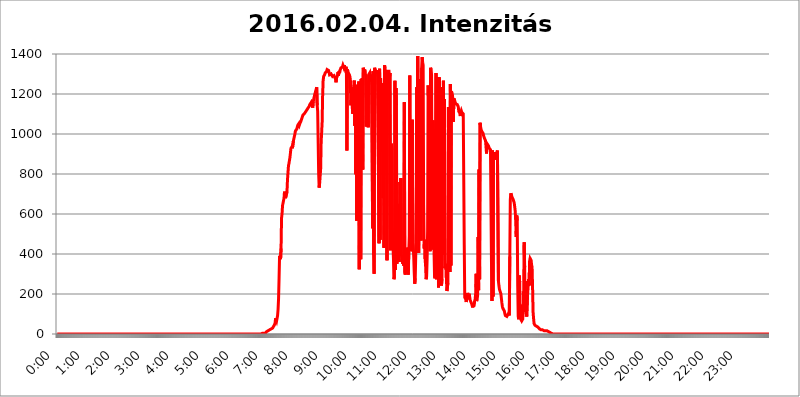
| Category | 2016.02.04. Intenzitás [W/m^2] |
|---|---|
| 0.0 | 0 |
| 0.0006944444444444445 | 0 |
| 0.001388888888888889 | 0 |
| 0.0020833333333333333 | 0 |
| 0.002777777777777778 | 0 |
| 0.003472222222222222 | 0 |
| 0.004166666666666667 | 0 |
| 0.004861111111111111 | 0 |
| 0.005555555555555556 | 0 |
| 0.0062499999999999995 | 0 |
| 0.006944444444444444 | 0 |
| 0.007638888888888889 | 0 |
| 0.008333333333333333 | 0 |
| 0.009027777777777779 | 0 |
| 0.009722222222222222 | 0 |
| 0.010416666666666666 | 0 |
| 0.011111111111111112 | 0 |
| 0.011805555555555555 | 0 |
| 0.012499999999999999 | 0 |
| 0.013194444444444444 | 0 |
| 0.013888888888888888 | 0 |
| 0.014583333333333332 | 0 |
| 0.015277777777777777 | 0 |
| 0.015972222222222224 | 0 |
| 0.016666666666666666 | 0 |
| 0.017361111111111112 | 0 |
| 0.018055555555555557 | 0 |
| 0.01875 | 0 |
| 0.019444444444444445 | 0 |
| 0.02013888888888889 | 0 |
| 0.020833333333333332 | 0 |
| 0.02152777777777778 | 0 |
| 0.022222222222222223 | 0 |
| 0.02291666666666667 | 0 |
| 0.02361111111111111 | 0 |
| 0.024305555555555556 | 0 |
| 0.024999999999999998 | 0 |
| 0.025694444444444447 | 0 |
| 0.02638888888888889 | 0 |
| 0.027083333333333334 | 0 |
| 0.027777777777777776 | 0 |
| 0.02847222222222222 | 0 |
| 0.029166666666666664 | 0 |
| 0.029861111111111113 | 0 |
| 0.030555555555555555 | 0 |
| 0.03125 | 0 |
| 0.03194444444444445 | 0 |
| 0.03263888888888889 | 0 |
| 0.03333333333333333 | 0 |
| 0.034027777777777775 | 0 |
| 0.034722222222222224 | 0 |
| 0.035416666666666666 | 0 |
| 0.036111111111111115 | 0 |
| 0.03680555555555556 | 0 |
| 0.0375 | 0 |
| 0.03819444444444444 | 0 |
| 0.03888888888888889 | 0 |
| 0.03958333333333333 | 0 |
| 0.04027777777777778 | 0 |
| 0.04097222222222222 | 0 |
| 0.041666666666666664 | 0 |
| 0.042361111111111106 | 0 |
| 0.04305555555555556 | 0 |
| 0.043750000000000004 | 0 |
| 0.044444444444444446 | 0 |
| 0.04513888888888889 | 0 |
| 0.04583333333333334 | 0 |
| 0.04652777777777778 | 0 |
| 0.04722222222222222 | 0 |
| 0.04791666666666666 | 0 |
| 0.04861111111111111 | 0 |
| 0.049305555555555554 | 0 |
| 0.049999999999999996 | 0 |
| 0.05069444444444445 | 0 |
| 0.051388888888888894 | 0 |
| 0.052083333333333336 | 0 |
| 0.05277777777777778 | 0 |
| 0.05347222222222222 | 0 |
| 0.05416666666666667 | 0 |
| 0.05486111111111111 | 0 |
| 0.05555555555555555 | 0 |
| 0.05625 | 0 |
| 0.05694444444444444 | 0 |
| 0.057638888888888885 | 0 |
| 0.05833333333333333 | 0 |
| 0.05902777777777778 | 0 |
| 0.059722222222222225 | 0 |
| 0.06041666666666667 | 0 |
| 0.061111111111111116 | 0 |
| 0.06180555555555556 | 0 |
| 0.0625 | 0 |
| 0.06319444444444444 | 0 |
| 0.06388888888888888 | 0 |
| 0.06458333333333334 | 0 |
| 0.06527777777777778 | 0 |
| 0.06597222222222222 | 0 |
| 0.06666666666666667 | 0 |
| 0.06736111111111111 | 0 |
| 0.06805555555555555 | 0 |
| 0.06874999999999999 | 0 |
| 0.06944444444444443 | 0 |
| 0.07013888888888889 | 0 |
| 0.07083333333333333 | 0 |
| 0.07152777777777779 | 0 |
| 0.07222222222222223 | 0 |
| 0.07291666666666667 | 0 |
| 0.07361111111111111 | 0 |
| 0.07430555555555556 | 0 |
| 0.075 | 0 |
| 0.07569444444444444 | 0 |
| 0.0763888888888889 | 0 |
| 0.07708333333333334 | 0 |
| 0.07777777777777778 | 0 |
| 0.07847222222222222 | 0 |
| 0.07916666666666666 | 0 |
| 0.0798611111111111 | 0 |
| 0.08055555555555556 | 0 |
| 0.08125 | 0 |
| 0.08194444444444444 | 0 |
| 0.08263888888888889 | 0 |
| 0.08333333333333333 | 0 |
| 0.08402777777777777 | 0 |
| 0.08472222222222221 | 0 |
| 0.08541666666666665 | 0 |
| 0.08611111111111112 | 0 |
| 0.08680555555555557 | 0 |
| 0.08750000000000001 | 0 |
| 0.08819444444444445 | 0 |
| 0.08888888888888889 | 0 |
| 0.08958333333333333 | 0 |
| 0.09027777777777778 | 0 |
| 0.09097222222222222 | 0 |
| 0.09166666666666667 | 0 |
| 0.09236111111111112 | 0 |
| 0.09305555555555556 | 0 |
| 0.09375 | 0 |
| 0.09444444444444444 | 0 |
| 0.09513888888888888 | 0 |
| 0.09583333333333333 | 0 |
| 0.09652777777777777 | 0 |
| 0.09722222222222222 | 0 |
| 0.09791666666666667 | 0 |
| 0.09861111111111111 | 0 |
| 0.09930555555555555 | 0 |
| 0.09999999999999999 | 0 |
| 0.10069444444444443 | 0 |
| 0.1013888888888889 | 0 |
| 0.10208333333333335 | 0 |
| 0.10277777777777779 | 0 |
| 0.10347222222222223 | 0 |
| 0.10416666666666667 | 0 |
| 0.10486111111111111 | 0 |
| 0.10555555555555556 | 0 |
| 0.10625 | 0 |
| 0.10694444444444444 | 0 |
| 0.1076388888888889 | 0 |
| 0.10833333333333334 | 0 |
| 0.10902777777777778 | 0 |
| 0.10972222222222222 | 0 |
| 0.1111111111111111 | 0 |
| 0.11180555555555556 | 0 |
| 0.11180555555555556 | 0 |
| 0.1125 | 0 |
| 0.11319444444444444 | 0 |
| 0.11388888888888889 | 0 |
| 0.11458333333333333 | 0 |
| 0.11527777777777777 | 0 |
| 0.11597222222222221 | 0 |
| 0.11666666666666665 | 0 |
| 0.1173611111111111 | 0 |
| 0.11805555555555557 | 0 |
| 0.11944444444444445 | 0 |
| 0.12013888888888889 | 0 |
| 0.12083333333333333 | 0 |
| 0.12152777777777778 | 0 |
| 0.12222222222222223 | 0 |
| 0.12291666666666667 | 0 |
| 0.12291666666666667 | 0 |
| 0.12361111111111112 | 0 |
| 0.12430555555555556 | 0 |
| 0.125 | 0 |
| 0.12569444444444444 | 0 |
| 0.12638888888888888 | 0 |
| 0.12708333333333333 | 0 |
| 0.16875 | 0 |
| 0.12847222222222224 | 0 |
| 0.12916666666666668 | 0 |
| 0.12986111111111112 | 0 |
| 0.13055555555555556 | 0 |
| 0.13125 | 0 |
| 0.13194444444444445 | 0 |
| 0.1326388888888889 | 0 |
| 0.13333333333333333 | 0 |
| 0.13402777777777777 | 0 |
| 0.13402777777777777 | 0 |
| 0.13472222222222222 | 0 |
| 0.13541666666666666 | 0 |
| 0.1361111111111111 | 0 |
| 0.13749999999999998 | 0 |
| 0.13819444444444443 | 0 |
| 0.1388888888888889 | 0 |
| 0.13958333333333334 | 0 |
| 0.14027777777777778 | 0 |
| 0.14097222222222222 | 0 |
| 0.14166666666666666 | 0 |
| 0.1423611111111111 | 0 |
| 0.14305555555555557 | 0 |
| 0.14375000000000002 | 0 |
| 0.14444444444444446 | 0 |
| 0.1451388888888889 | 0 |
| 0.1451388888888889 | 0 |
| 0.14652777777777778 | 0 |
| 0.14722222222222223 | 0 |
| 0.14791666666666667 | 0 |
| 0.1486111111111111 | 0 |
| 0.14930555555555555 | 0 |
| 0.15 | 0 |
| 0.15069444444444444 | 0 |
| 0.15138888888888888 | 0 |
| 0.15208333333333332 | 0 |
| 0.15277777777777776 | 0 |
| 0.15347222222222223 | 0 |
| 0.15416666666666667 | 0 |
| 0.15486111111111112 | 0 |
| 0.15555555555555556 | 0 |
| 0.15625 | 0 |
| 0.15694444444444444 | 0 |
| 0.15763888888888888 | 0 |
| 0.15833333333333333 | 0 |
| 0.15902777777777777 | 0 |
| 0.15972222222222224 | 0 |
| 0.16041666666666668 | 0 |
| 0.16111111111111112 | 0 |
| 0.16180555555555556 | 0 |
| 0.1625 | 0 |
| 0.16319444444444445 | 0 |
| 0.1638888888888889 | 0 |
| 0.16458333333333333 | 0 |
| 0.16527777777777777 | 0 |
| 0.16597222222222222 | 0 |
| 0.16666666666666666 | 0 |
| 0.1673611111111111 | 0 |
| 0.16805555555555554 | 0 |
| 0.16874999999999998 | 0 |
| 0.16944444444444443 | 0 |
| 0.17013888888888887 | 0 |
| 0.1708333333333333 | 0 |
| 0.17152777777777775 | 0 |
| 0.17222222222222225 | 0 |
| 0.1729166666666667 | 0 |
| 0.17361111111111113 | 0 |
| 0.17430555555555557 | 0 |
| 0.17500000000000002 | 0 |
| 0.17569444444444446 | 0 |
| 0.1763888888888889 | 0 |
| 0.17708333333333334 | 0 |
| 0.17777777777777778 | 0 |
| 0.17847222222222223 | 0 |
| 0.17916666666666667 | 0 |
| 0.1798611111111111 | 0 |
| 0.18055555555555555 | 0 |
| 0.18125 | 0 |
| 0.18194444444444444 | 0 |
| 0.1826388888888889 | 0 |
| 0.18333333333333335 | 0 |
| 0.1840277777777778 | 0 |
| 0.18472222222222223 | 0 |
| 0.18541666666666667 | 0 |
| 0.18611111111111112 | 0 |
| 0.18680555555555556 | 0 |
| 0.1875 | 0 |
| 0.18819444444444444 | 0 |
| 0.18888888888888888 | 0 |
| 0.18958333333333333 | 0 |
| 0.19027777777777777 | 0 |
| 0.1909722222222222 | 0 |
| 0.19166666666666665 | 0 |
| 0.19236111111111112 | 0 |
| 0.19305555555555554 | 0 |
| 0.19375 | 0 |
| 0.19444444444444445 | 0 |
| 0.1951388888888889 | 0 |
| 0.19583333333333333 | 0 |
| 0.19652777777777777 | 0 |
| 0.19722222222222222 | 0 |
| 0.19791666666666666 | 0 |
| 0.1986111111111111 | 0 |
| 0.19930555555555554 | 0 |
| 0.19999999999999998 | 0 |
| 0.20069444444444443 | 0 |
| 0.20138888888888887 | 0 |
| 0.2020833333333333 | 0 |
| 0.2027777777777778 | 0 |
| 0.2034722222222222 | 0 |
| 0.2041666666666667 | 0 |
| 0.20486111111111113 | 0 |
| 0.20555555555555557 | 0 |
| 0.20625000000000002 | 0 |
| 0.20694444444444446 | 0 |
| 0.2076388888888889 | 0 |
| 0.20833333333333334 | 0 |
| 0.20902777777777778 | 0 |
| 0.20972222222222223 | 0 |
| 0.21041666666666667 | 0 |
| 0.2111111111111111 | 0 |
| 0.21180555555555555 | 0 |
| 0.2125 | 0 |
| 0.21319444444444444 | 0 |
| 0.2138888888888889 | 0 |
| 0.21458333333333335 | 0 |
| 0.2152777777777778 | 0 |
| 0.21597222222222223 | 0 |
| 0.21666666666666667 | 0 |
| 0.21736111111111112 | 0 |
| 0.21805555555555556 | 0 |
| 0.21875 | 0 |
| 0.21944444444444444 | 0 |
| 0.22013888888888888 | 0 |
| 0.22083333333333333 | 0 |
| 0.22152777777777777 | 0 |
| 0.2222222222222222 | 0 |
| 0.22291666666666665 | 0 |
| 0.2236111111111111 | 0 |
| 0.22430555555555556 | 0 |
| 0.225 | 0 |
| 0.22569444444444445 | 0 |
| 0.2263888888888889 | 0 |
| 0.22708333333333333 | 0 |
| 0.22777777777777777 | 0 |
| 0.22847222222222222 | 0 |
| 0.22916666666666666 | 0 |
| 0.2298611111111111 | 0 |
| 0.23055555555555554 | 0 |
| 0.23124999999999998 | 0 |
| 0.23194444444444443 | 0 |
| 0.23263888888888887 | 0 |
| 0.2333333333333333 | 0 |
| 0.2340277777777778 | 0 |
| 0.2347222222222222 | 0 |
| 0.2354166666666667 | 0 |
| 0.23611111111111113 | 0 |
| 0.23680555555555557 | 0 |
| 0.23750000000000002 | 0 |
| 0.23819444444444446 | 0 |
| 0.2388888888888889 | 0 |
| 0.23958333333333334 | 0 |
| 0.24027777777777778 | 0 |
| 0.24097222222222223 | 0 |
| 0.24166666666666667 | 0 |
| 0.2423611111111111 | 0 |
| 0.24305555555555555 | 0 |
| 0.24375 | 0 |
| 0.24444444444444446 | 0 |
| 0.24513888888888888 | 0 |
| 0.24583333333333335 | 0 |
| 0.2465277777777778 | 0 |
| 0.24722222222222223 | 0 |
| 0.24791666666666667 | 0 |
| 0.24861111111111112 | 0 |
| 0.24930555555555556 | 0 |
| 0.25 | 0 |
| 0.25069444444444444 | 0 |
| 0.2513888888888889 | 0 |
| 0.2520833333333333 | 0 |
| 0.25277777777777777 | 0 |
| 0.2534722222222222 | 0 |
| 0.25416666666666665 | 0 |
| 0.2548611111111111 | 0 |
| 0.2555555555555556 | 0 |
| 0.25625000000000003 | 0 |
| 0.2569444444444445 | 0 |
| 0.2576388888888889 | 0 |
| 0.25833333333333336 | 0 |
| 0.2590277777777778 | 0 |
| 0.25972222222222224 | 0 |
| 0.2604166666666667 | 0 |
| 0.2611111111111111 | 0 |
| 0.26180555555555557 | 0 |
| 0.2625 | 0 |
| 0.26319444444444445 | 0 |
| 0.2638888888888889 | 0 |
| 0.26458333333333334 | 0 |
| 0.2652777777777778 | 0 |
| 0.2659722222222222 | 0 |
| 0.26666666666666666 | 0 |
| 0.2673611111111111 | 0 |
| 0.26805555555555555 | 0 |
| 0.26875 | 0 |
| 0.26944444444444443 | 0 |
| 0.2701388888888889 | 0 |
| 0.2708333333333333 | 0 |
| 0.27152777777777776 | 0 |
| 0.2722222222222222 | 0 |
| 0.27291666666666664 | 0 |
| 0.2736111111111111 | 0 |
| 0.2743055555555555 | 0 |
| 0.27499999999999997 | 0 |
| 0.27569444444444446 | 0 |
| 0.27638888888888885 | 0 |
| 0.27708333333333335 | 0 |
| 0.2777777777777778 | 0 |
| 0.27847222222222223 | 0 |
| 0.2791666666666667 | 0 |
| 0.2798611111111111 | 0 |
| 0.28055555555555556 | 0 |
| 0.28125 | 0 |
| 0.28194444444444444 | 0 |
| 0.2826388888888889 | 0 |
| 0.2833333333333333 | 0 |
| 0.28402777777777777 | 0 |
| 0.2847222222222222 | 0 |
| 0.28541666666666665 | 0 |
| 0.28611111111111115 | 0 |
| 0.28680555555555554 | 3.525 |
| 0.28750000000000003 | 3.525 |
| 0.2881944444444445 | 3.525 |
| 0.2888888888888889 | 3.525 |
| 0.28958333333333336 | 3.525 |
| 0.2902777777777778 | 3.525 |
| 0.29097222222222224 | 3.525 |
| 0.2916666666666667 | 3.525 |
| 0.2923611111111111 | 3.525 |
| 0.29305555555555557 | 7.887 |
| 0.29375 | 12.257 |
| 0.29444444444444445 | 12.257 |
| 0.2951388888888889 | 12.257 |
| 0.29583333333333334 | 16.636 |
| 0.2965277777777778 | 16.636 |
| 0.2972222222222222 | 16.636 |
| 0.29791666666666666 | 21.024 |
| 0.2986111111111111 | 21.024 |
| 0.29930555555555555 | 21.024 |
| 0.3 | 25.419 |
| 0.30069444444444443 | 25.419 |
| 0.3013888888888889 | 29.823 |
| 0.3020833333333333 | 29.823 |
| 0.30277777777777776 | 34.234 |
| 0.3034722222222222 | 38.653 |
| 0.30416666666666664 | 38.653 |
| 0.3048611111111111 | 47.511 |
| 0.3055555555555555 | 56.398 |
| 0.30624999999999997 | 78.722 |
| 0.3069444444444444 | 74.246 |
| 0.3076388888888889 | 65.31 |
| 0.30833333333333335 | 69.775 |
| 0.3090277777777778 | 92.184 |
| 0.30972222222222223 | 123.758 |
| 0.3104166666666667 | 178.264 |
| 0.3111111111111111 | 278.603 |
| 0.31180555555555556 | 391.685 |
| 0.3125 | 387.202 |
| 0.31319444444444444 | 373.729 |
| 0.3138888888888889 | 427.39 |
| 0.3145833333333333 | 579.542 |
| 0.31527777777777777 | 600.661 |
| 0.3159722222222222 | 642.4 |
| 0.31666666666666665 | 638.256 |
| 0.31736111111111115 | 638.256 |
| 0.31805555555555554 | 679.395 |
| 0.31875000000000003 | 711.832 |
| 0.3194444444444445 | 711.832 |
| 0.3201388888888889 | 679.395 |
| 0.32083333333333336 | 675.311 |
| 0.3215277777777778 | 679.395 |
| 0.32222222222222224 | 711.832 |
| 0.3229166666666667 | 771.559 |
| 0.3236111111111111 | 806.757 |
| 0.32430555555555557 | 841.526 |
| 0.325 | 853.029 |
| 0.32569444444444445 | 853.029 |
| 0.3263888888888889 | 883.516 |
| 0.32708333333333334 | 906.223 |
| 0.3277777777777778 | 928.819 |
| 0.3284722222222222 | 925.06 |
| 0.32916666666666666 | 936.33 |
| 0.3298611111111111 | 928.819 |
| 0.33055555555555555 | 925.06 |
| 0.33125 | 966.295 |
| 0.33194444444444443 | 977.508 |
| 0.3326388888888889 | 981.244 |
| 0.3333333333333333 | 999.916 |
| 0.3340277777777778 | 1014.852 |
| 0.3347222222222222 | 1018.587 |
| 0.3354166666666667 | 1018.587 |
| 0.3361111111111111 | 1026.06 |
| 0.3368055555555556 | 1037.277 |
| 0.33749999999999997 | 1044.762 |
| 0.33819444444444446 | 1044.762 |
| 0.33888888888888885 | 1052.255 |
| 0.33958333333333335 | 1044.762 |
| 0.34027777777777773 | 1052.255 |
| 0.34097222222222223 | 1052.255 |
| 0.3416666666666666 | 1063.51 |
| 0.3423611111111111 | 1071.027 |
| 0.3430555555555555 | 1078.555 |
| 0.34375 | 1082.324 |
| 0.3444444444444445 | 1093.653 |
| 0.3451388888888889 | 1097.437 |
| 0.3458333333333334 | 1097.437 |
| 0.34652777777777777 | 1101.226 |
| 0.34722222222222227 | 1101.226 |
| 0.34791666666666665 | 1101.226 |
| 0.34861111111111115 | 1112.618 |
| 0.34930555555555554 | 1108.816 |
| 0.35000000000000003 | 1116.426 |
| 0.3506944444444444 | 1124.056 |
| 0.3513888888888889 | 1124.056 |
| 0.3520833333333333 | 1131.708 |
| 0.3527777777777778 | 1135.543 |
| 0.3534722222222222 | 1139.384 |
| 0.3541666666666667 | 1147.086 |
| 0.3548611111111111 | 1147.086 |
| 0.35555555555555557 | 1150.946 |
| 0.35625 | 1158.689 |
| 0.35694444444444445 | 1158.689 |
| 0.3576388888888889 | 1162.571 |
| 0.35833333333333334 | 1131.708 |
| 0.3590277777777778 | 1162.571 |
| 0.3597222222222222 | 1174.263 |
| 0.36041666666666666 | 1186.03 |
| 0.3611111111111111 | 1197.876 |
| 0.36180555555555555 | 1205.82 |
| 0.3625 | 1201.843 |
| 0.36319444444444443 | 1209.807 |
| 0.3638888888888889 | 1233.951 |
| 0.3645833333333333 | 1143.232 |
| 0.3652777777777778 | 1112.618 |
| 0.3659722222222222 | 955.071 |
| 0.3666666666666667 | 798.974 |
| 0.3673611111111111 | 731.896 |
| 0.3680555555555556 | 755.766 |
| 0.36874999999999997 | 791.169 |
| 0.36944444444444446 | 826.123 |
| 0.37013888888888885 | 958.814 |
| 0.37083333333333335 | 958.814 |
| 0.37152777777777773 | 1059.756 |
| 0.37222222222222223 | 1193.918 |
| 0.3729166666666666 | 1266.8 |
| 0.3736111111111111 | 1287.761 |
| 0.3743055555555555 | 1291.997 |
| 0.375 | 1296.248 |
| 0.3756944444444445 | 1304.795 |
| 0.3763888888888889 | 1304.795 |
| 0.3770833333333334 | 1304.795 |
| 0.37777777777777777 | 1313.406 |
| 0.37847222222222227 | 1322.082 |
| 0.37916666666666665 | 1326.445 |
| 0.37986111111111115 | 1326.445 |
| 0.38055555555555554 | 1317.736 |
| 0.38125000000000003 | 1313.406 |
| 0.3819444444444444 | 1296.248 |
| 0.3826388888888889 | 1291.997 |
| 0.3833333333333333 | 1291.997 |
| 0.3840277777777778 | 1300.514 |
| 0.3847222222222222 | 1300.514 |
| 0.3854166666666667 | 1296.248 |
| 0.3861111111111111 | 1287.761 |
| 0.38680555555555557 | 1287.761 |
| 0.3875 | 1283.541 |
| 0.38819444444444445 | 1291.997 |
| 0.3888888888888889 | 1291.997 |
| 0.38958333333333334 | 1287.761 |
| 0.3902777777777778 | 1275.142 |
| 0.3909722222222222 | 1258.511 |
| 0.39166666666666666 | 1279.334 |
| 0.3923611111111111 | 1283.541 |
| 0.39305555555555555 | 1291.997 |
| 0.39375 | 1309.093 |
| 0.39444444444444443 | 1291.997 |
| 0.3951388888888889 | 1313.406 |
| 0.3958333333333333 | 1304.795 |
| 0.3965277777777778 | 1317.736 |
| 0.3972222222222222 | 1317.736 |
| 0.3979166666666667 | 1330.826 |
| 0.3986111111111111 | 1335.223 |
| 0.3993055555555556 | 1330.826 |
| 0.39999999999999997 | 1335.223 |
| 0.40069444444444446 | 1344.072 |
| 0.40138888888888885 | 1339.639 |
| 0.40208333333333335 | 1330.826 |
| 0.40277777777777773 | 1344.072 |
| 0.40347222222222223 | 1344.072 |
| 0.4041666666666666 | 1317.736 |
| 0.4048611111111111 | 1335.223 |
| 0.4055555555555555 | 1326.445 |
| 0.40625 | 917.534 |
| 0.4069444444444445 | 1322.082 |
| 0.4076388888888889 | 1313.406 |
| 0.4083333333333334 | 1304.795 |
| 0.40902777777777777 | 1309.093 |
| 0.40972222222222227 | 1296.248 |
| 0.41041666666666665 | 1287.761 |
| 0.41111111111111115 | 1270.964 |
| 0.41180555555555554 | 1143.232 |
| 0.41250000000000003 | 1193.918 |
| 0.4131944444444444 | 1170.358 |
| 0.4138888888888889 | 1127.879 |
| 0.4145833333333333 | 1101.226 |
| 0.4152777777777778 | 1233.951 |
| 0.4159722222222222 | 1217.812 |
| 0.4166666666666667 | 1266.8 |
| 0.4173611111111111 | 1041.019 |
| 0.41805555555555557 | 1246.176 |
| 0.41875 | 798.974 |
| 0.41944444444444445 | 1225.859 |
| 0.4201388888888889 | 566.793 |
| 0.42083333333333334 | 1233.951 |
| 0.4215277777777778 | 1154.814 |
| 0.4222222222222222 | 1217.812 |
| 0.42291666666666666 | 1262.649 |
| 0.4236111111111111 | 324.052 |
| 0.42430555555555555 | 1238.014 |
| 0.425 | 1108.816 |
| 0.42569444444444443 | 373.729 |
| 0.4263888888888889 | 1275.142 |
| 0.4270833333333333 | 1205.82 |
| 0.4277777777777778 | 1279.334 |
| 0.4284722222222222 | 822.26 |
| 0.4291666666666667 | 1330.826 |
| 0.4298611111111111 | 1326.445 |
| 0.4305555555555556 | 1313.406 |
| 0.43124999999999997 | 1322.082 |
| 0.43194444444444446 | 1304.795 |
| 0.43263888888888885 | 1291.997 |
| 0.43333333333333335 | 1037.277 |
| 0.43402777777777773 | 1242.089 |
| 0.43472222222222223 | 1147.086 |
| 0.4354166666666666 | 1266.8 |
| 0.4361111111111111 | 1033.537 |
| 0.4368055555555555 | 1296.248 |
| 0.4375 | 1300.514 |
| 0.4381944444444445 | 1304.795 |
| 0.4388888888888889 | 1262.649 |
| 0.4395833333333334 | 1296.248 |
| 0.44027777777777777 | 1283.541 |
| 0.44097222222222227 | 1291.997 |
| 0.44166666666666665 | 1291.997 |
| 0.44236111111111115 | 528.2 |
| 0.44305555555555554 | 1313.406 |
| 0.44375000000000003 | 396.164 |
| 0.4444444444444444 | 301.354 |
| 0.4451388888888889 | 1330.826 |
| 0.4458333333333333 | 1317.736 |
| 0.4465277777777778 | 1313.406 |
| 0.4472222222222222 | 1313.406 |
| 0.4479166666666667 | 1313.406 |
| 0.4486111111111111 | 1300.514 |
| 0.44930555555555557 | 1317.736 |
| 0.45 | 1313.406 |
| 0.45069444444444445 | 1317.736 |
| 0.4513888888888889 | 453.968 |
| 0.45208333333333334 | 1326.445 |
| 0.4527777777777778 | 471.582 |
| 0.4534722222222222 | 1279.334 |
| 0.45416666666666666 | 943.832 |
| 0.4548611111111111 | 909.996 |
| 0.45555555555555555 | 1254.387 |
| 0.45625 | 1254.387 |
| 0.45694444444444443 | 679.395 |
| 0.4576388888888889 | 984.98 |
| 0.4583333333333333 | 431.833 |
| 0.4590277777777778 | 1344.072 |
| 0.4597222222222222 | 1330.826 |
| 0.4604166666666667 | 1296.248 |
| 0.4611111111111111 | 818.392 |
| 0.4618055555555556 | 1317.736 |
| 0.46249999999999997 | 369.23 |
| 0.46319444444444446 | 1313.406 |
| 0.46388888888888885 | 1317.736 |
| 0.46458333333333335 | 1313.406 |
| 0.46527777777777773 | 1313.406 |
| 0.46597222222222223 | 1283.541 |
| 0.4666666666666666 | 1304.795 |
| 0.4673611111111111 | 418.492 |
| 0.4680555555555555 | 806.757 |
| 0.46875 | 951.327 |
| 0.4694444444444445 | 921.298 |
| 0.4701388888888889 | 515.223 |
| 0.4708333333333334 | 449.551 |
| 0.47152777777777777 | 378.224 |
| 0.47222222222222227 | 274.047 |
| 0.47291666666666665 | 287.709 |
| 0.47361111111111115 | 1266.8 |
| 0.47430555555555554 | 319.517 |
| 0.47500000000000003 | 1229.899 |
| 0.4756944444444444 | 1143.232 |
| 0.4763888888888889 | 351.198 |
| 0.4770833333333333 | 431.833 |
| 0.4777777777777778 | 650.667 |
| 0.4784722222222222 | 382.715 |
| 0.4791666666666667 | 360.221 |
| 0.4798611111111111 | 467.187 |
| 0.48055555555555557 | 759.723 |
| 0.48125 | 400.638 |
| 0.48194444444444445 | 779.42 |
| 0.4826388888888889 | 405.108 |
| 0.48333333333333334 | 360.221 |
| 0.4840277777777778 | 373.729 |
| 0.4847222222222222 | 351.198 |
| 0.48541666666666666 | 378.224 |
| 0.4861111111111111 | 342.162 |
| 0.48680555555555555 | 1158.689 |
| 0.4875 | 305.898 |
| 0.48819444444444443 | 296.808 |
| 0.4888888888888889 | 378.224 |
| 0.4895833333333333 | 378.224 |
| 0.4902777777777778 | 431.833 |
| 0.4909722222222222 | 351.198 |
| 0.4916666666666667 | 319.517 |
| 0.4923611111111111 | 296.808 |
| 0.4930555555555556 | 409.574 |
| 0.49374999999999997 | 489.108 |
| 0.49444444444444446 | 1291.997 |
| 0.49513888888888885 | 502.192 |
| 0.49583333333333335 | 471.582 |
| 0.49652777777777773 | 625.784 |
| 0.49722222222222223 | 414.035 |
| 0.4979166666666666 | 1071.027 |
| 0.4986111111111111 | 462.786 |
| 0.4993055555555555 | 440.702 |
| 0.5 | 382.715 |
| 0.5006944444444444 | 305.898 |
| 0.5013888888888889 | 251.251 |
| 0.5020833333333333 | 278.603 |
| 0.5027777777777778 | 391.685 |
| 0.5034722222222222 | 719.877 |
| 0.5041666666666667 | 1233.951 |
| 0.5048611111111111 | 604.864 |
| 0.5055555555555555 | 1389.456 |
| 0.50625 | 970.034 |
| 0.5069444444444444 | 405.108 |
| 0.5076388888888889 | 1089.873 |
| 0.5083333333333333 | 541.121 |
| 0.5090277777777777 | 1275.142 |
| 0.5097222222222222 | 553.986 |
| 0.5104166666666666 | 467.187 |
| 0.5111111111111112 | 1330.826 |
| 0.5118055555555555 | 1384.828 |
| 0.5125000000000001 | 1357.483 |
| 0.5131944444444444 | 1344.072 |
| 0.513888888888889 | 646.537 |
| 0.5145833333333333 | 427.39 |
| 0.5152777777777778 | 471.582 |
| 0.5159722222222222 | 373.729 |
| 0.5166666666666667 | 337.639 |
| 0.517361111111111 | 274.047 |
| 0.5180555555555556 | 287.709 |
| 0.5187499999999999 | 373.729 |
| 0.5194444444444445 | 515.223 |
| 0.5201388888888888 | 1242.089 |
| 0.5208333333333334 | 1150.946 |
| 0.5215277777777778 | 1217.812 |
| 0.5222222222222223 | 536.82 |
| 0.5229166666666667 | 414.035 |
| 0.5236111111111111 | 1330.826 |
| 0.5243055555555556 | 1322.082 |
| 0.525 | 1296.248 |
| 0.5256944444444445 | 629.948 |
| 0.5263888888888889 | 422.943 |
| 0.5270833333333333 | 1067.267 |
| 0.5277777777777778 | 1003.65 |
| 0.5284722222222222 | 409.574 |
| 0.5291666666666667 | 287.709 |
| 0.5298611111111111 | 278.603 |
| 0.5305555555555556 | 902.447 |
| 0.53125 | 1304.795 |
| 0.5319444444444444 | 274.047 |
| 0.5326388888888889 | 1283.541 |
| 0.5333333333333333 | 1270.964 |
| 0.5340277777777778 | 1139.384 |
| 0.5347222222222222 | 233 |
| 0.5354166666666667 | 1283.541 |
| 0.5361111111111111 | 1266.8 |
| 0.5368055555555555 | 301.354 |
| 0.5375 | 287.709 |
| 0.5381944444444444 | 274.047 |
| 0.5388888888888889 | 242.127 |
| 0.5395833333333333 | 274.047 |
| 0.5402777777777777 | 1233.951 |
| 0.5409722222222222 | 396.164 |
| 0.5416666666666666 | 1266.8 |
| 0.5423611111111112 | 458.38 |
| 0.5430555555555555 | 1174.263 |
| 0.5437500000000001 | 328.584 |
| 0.5444444444444444 | 333.113 |
| 0.545138888888889 | 351.198 |
| 0.5458333333333333 | 274.047 |
| 0.5465277777777778 | 214.746 |
| 0.5472222222222222 | 214.746 |
| 0.5479166666666667 | 255.813 |
| 0.548611111111111 | 1135.543 |
| 0.5493055555555556 | 328.584 |
| 0.5499999999999999 | 502.192 |
| 0.5506944444444445 | 310.44 |
| 0.5513888888888888 | 1250.275 |
| 0.5520833333333334 | 342.162 |
| 0.5527777777777778 | 1213.804 |
| 0.5534722222222223 | 1205.82 |
| 0.5541666666666667 | 1197.876 |
| 0.5548611111111111 | 1174.263 |
| 0.5555555555555556 | 1059.756 |
| 0.55625 | 1178.177 |
| 0.5569444444444445 | 1174.263 |
| 0.5576388888888889 | 1162.571 |
| 0.5583333333333333 | 1162.571 |
| 0.5590277777777778 | 1150.946 |
| 0.5597222222222222 | 1154.814 |
| 0.5604166666666667 | 1147.086 |
| 0.5611111111111111 | 1147.086 |
| 0.5618055555555556 | 1147.086 |
| 0.5625 | 1135.543 |
| 0.5631944444444444 | 1112.618 |
| 0.5638888888888889 | 1116.426 |
| 0.5645833333333333 | 1105.019 |
| 0.5652777777777778 | 1089.873 |
| 0.5659722222222222 | 1108.816 |
| 0.5666666666666667 | 1116.426 |
| 0.5673611111111111 | 1108.816 |
| 0.5680555555555555 | 1112.618 |
| 0.56875 | 1105.019 |
| 0.5694444444444444 | 1101.226 |
| 0.5701388888888889 | 1105.019 |
| 0.5708333333333333 | 445.129 |
| 0.5715277777777777 | 182.82 |
| 0.5722222222222222 | 178.264 |
| 0.5729166666666666 | 173.709 |
| 0.5736111111111112 | 160.056 |
| 0.5743055555555555 | 173.709 |
| 0.5750000000000001 | 187.378 |
| 0.5756944444444444 | 205.62 |
| 0.576388888888889 | 173.709 |
| 0.5770833333333333 | 191.937 |
| 0.5777777777777778 | 201.058 |
| 0.5784722222222222 | 182.82 |
| 0.5791666666666667 | 169.156 |
| 0.579861111111111 | 169.156 |
| 0.5805555555555556 | 164.605 |
| 0.5812499999999999 | 150.964 |
| 0.5819444444444445 | 141.884 |
| 0.5826388888888888 | 132.814 |
| 0.5833333333333334 | 146.423 |
| 0.5840277777777778 | 137.347 |
| 0.5847222222222223 | 132.814 |
| 0.5854166666666667 | 164.605 |
| 0.5861111111111111 | 173.709 |
| 0.5868055555555556 | 201.058 |
| 0.5875 | 301.354 |
| 0.5881944444444445 | 164.605 |
| 0.5888888888888889 | 173.709 |
| 0.5895833333333333 | 191.937 |
| 0.5902777777777778 | 484.735 |
| 0.5909722222222222 | 219.309 |
| 0.5916666666666667 | 822.26 |
| 0.5923611111111111 | 274.047 |
| 0.5930555555555556 | 1056.004 |
| 0.59375 | 1037.277 |
| 0.5944444444444444 | 1022.323 |
| 0.5951388888888889 | 1022.323 |
| 0.5958333333333333 | 1011.118 |
| 0.5965277777777778 | 1007.383 |
| 0.5972222222222222 | 1003.65 |
| 0.5979166666666667 | 992.448 |
| 0.5986111111111111 | 992.448 |
| 0.5993055555555555 | 977.508 |
| 0.6 | 977.508 |
| 0.6006944444444444 | 966.295 |
| 0.6013888888888889 | 966.295 |
| 0.6020833333333333 | 902.447 |
| 0.6027777777777777 | 951.327 |
| 0.6034722222222222 | 955.071 |
| 0.6041666666666666 | 947.58 |
| 0.6048611111111112 | 940.082 |
| 0.6055555555555555 | 932.576 |
| 0.6062500000000001 | 932.576 |
| 0.6069444444444444 | 932.576 |
| 0.607638888888889 | 921.298 |
| 0.6083333333333333 | 917.534 |
| 0.6090277777777778 | 360.221 |
| 0.6097222222222222 | 164.605 |
| 0.6104166666666667 | 917.534 |
| 0.611111111111111 | 187.378 |
| 0.6118055555555556 | 887.309 |
| 0.6124999999999999 | 909.996 |
| 0.6131944444444445 | 872.114 |
| 0.6138888888888888 | 902.447 |
| 0.6145833333333334 | 902.447 |
| 0.6152777777777778 | 898.668 |
| 0.6159722222222223 | 902.447 |
| 0.6166666666666667 | 898.668 |
| 0.6173611111111111 | 917.534 |
| 0.6180555555555556 | 913.766 |
| 0.61875 | 264.932 |
| 0.6194444444444445 | 242.127 |
| 0.6201388888888889 | 223.873 |
| 0.6208333333333333 | 223.873 |
| 0.6215277777777778 | 219.309 |
| 0.6222222222222222 | 201.058 |
| 0.6229166666666667 | 178.264 |
| 0.6236111111111111 | 155.509 |
| 0.6243055555555556 | 137.347 |
| 0.625 | 128.284 |
| 0.6256944444444444 | 128.284 |
| 0.6263888888888889 | 123.758 |
| 0.6270833333333333 | 114.716 |
| 0.6277777777777778 | 101.184 |
| 0.6284722222222222 | 92.184 |
| 0.6291666666666667 | 87.692 |
| 0.6298611111111111 | 87.692 |
| 0.6305555555555555 | 87.692 |
| 0.63125 | 92.184 |
| 0.6319444444444444 | 92.184 |
| 0.6326388888888889 | 101.184 |
| 0.6333333333333333 | 96.682 |
| 0.6340277777777777 | 92.184 |
| 0.6347222222222222 | 387.202 |
| 0.6354166666666666 | 671.22 |
| 0.6361111111111112 | 703.762 |
| 0.6368055555555555 | 703.762 |
| 0.6375000000000001 | 687.544 |
| 0.6381944444444444 | 687.544 |
| 0.638888888888889 | 683.473 |
| 0.6395833333333333 | 671.22 |
| 0.6402777777777778 | 663.019 |
| 0.6409722222222222 | 654.791 |
| 0.6416666666666667 | 650.667 |
| 0.642361111111111 | 613.252 |
| 0.6430555555555556 | 558.261 |
| 0.6437499999999999 | 484.735 |
| 0.6444444444444445 | 592.233 |
| 0.6451388888888888 | 566.793 |
| 0.6458333333333334 | 237.564 |
| 0.6465277777777778 | 87.692 |
| 0.6472222222222223 | 74.246 |
| 0.6479166666666667 | 292.259 |
| 0.6486111111111111 | 260.373 |
| 0.6493055555555556 | 128.284 |
| 0.65 | 74.246 |
| 0.6506944444444445 | 69.775 |
| 0.6513888888888889 | 65.31 |
| 0.6520833333333333 | 65.31 |
| 0.6527777777777778 | 74.246 |
| 0.6534722222222222 | 101.184 |
| 0.6541666666666667 | 223.873 |
| 0.6548611111111111 | 458.38 |
| 0.6555555555555556 | 333.113 |
| 0.65625 | 123.758 |
| 0.6569444444444444 | 110.201 |
| 0.6576388888888889 | 264.932 |
| 0.6583333333333333 | 87.692 |
| 0.6590277777777778 | 83.205 |
| 0.6597222222222222 | 201.058 |
| 0.6604166666666667 | 201.058 |
| 0.6611111111111111 | 274.047 |
| 0.6618055555555555 | 242.127 |
| 0.6625 | 364.728 |
| 0.6631944444444444 | 378.224 |
| 0.6638888888888889 | 378.224 |
| 0.6645833333333333 | 369.23 |
| 0.6652777777777777 | 346.682 |
| 0.6659722222222222 | 333.113 |
| 0.6666666666666666 | 233 |
| 0.6673611111111111 | 110.201 |
| 0.6680555555555556 | 78.722 |
| 0.6687500000000001 | 51.951 |
| 0.6694444444444444 | 47.511 |
| 0.6701388888888888 | 43.079 |
| 0.6708333333333334 | 38.653 |
| 0.6715277777777778 | 38.653 |
| 0.6722222222222222 | 38.653 |
| 0.6729166666666666 | 34.234 |
| 0.6736111111111112 | 34.234 |
| 0.6743055555555556 | 34.234 |
| 0.6749999999999999 | 29.823 |
| 0.6756944444444444 | 29.823 |
| 0.6763888888888889 | 25.419 |
| 0.6770833333333334 | 25.419 |
| 0.6777777777777777 | 25.419 |
| 0.6784722222222223 | 21.024 |
| 0.6791666666666667 | 21.024 |
| 0.6798611111111111 | 21.024 |
| 0.6805555555555555 | 21.024 |
| 0.68125 | 21.024 |
| 0.6819444444444445 | 21.024 |
| 0.6826388888888889 | 16.636 |
| 0.6833333333333332 | 21.024 |
| 0.6840277777777778 | 16.636 |
| 0.6847222222222222 | 16.636 |
| 0.6854166666666667 | 16.636 |
| 0.686111111111111 | 16.636 |
| 0.6868055555555556 | 16.636 |
| 0.6875 | 12.257 |
| 0.6881944444444444 | 12.257 |
| 0.688888888888889 | 12.257 |
| 0.6895833333333333 | 12.257 |
| 0.6902777777777778 | 7.887 |
| 0.6909722222222222 | 7.887 |
| 0.6916666666666668 | 7.887 |
| 0.6923611111111111 | 7.887 |
| 0.6930555555555555 | 3.525 |
| 0.69375 | 3.525 |
| 0.6944444444444445 | 3.525 |
| 0.6951388888888889 | 0 |
| 0.6958333333333333 | 0 |
| 0.6965277777777777 | 0 |
| 0.6972222222222223 | 0 |
| 0.6979166666666666 | 0 |
| 0.6986111111111111 | 0 |
| 0.6993055555555556 | 0 |
| 0.7000000000000001 | 0 |
| 0.7006944444444444 | 0 |
| 0.7013888888888888 | 0 |
| 0.7020833333333334 | 0 |
| 0.7027777777777778 | 0 |
| 0.7034722222222222 | 0 |
| 0.7041666666666666 | 0 |
| 0.7048611111111112 | 0 |
| 0.7055555555555556 | 0 |
| 0.7062499999999999 | 0 |
| 0.7069444444444444 | 0 |
| 0.7076388888888889 | 0 |
| 0.7083333333333334 | 0 |
| 0.7090277777777777 | 0 |
| 0.7097222222222223 | 0 |
| 0.7104166666666667 | 0 |
| 0.7111111111111111 | 0 |
| 0.7118055555555555 | 0 |
| 0.7125 | 0 |
| 0.7131944444444445 | 0 |
| 0.7138888888888889 | 0 |
| 0.7145833333333332 | 0 |
| 0.7152777777777778 | 0 |
| 0.7159722222222222 | 0 |
| 0.7166666666666667 | 0 |
| 0.717361111111111 | 0 |
| 0.7180555555555556 | 0 |
| 0.71875 | 0 |
| 0.7194444444444444 | 0 |
| 0.720138888888889 | 0 |
| 0.7208333333333333 | 0 |
| 0.7215277777777778 | 0 |
| 0.7222222222222222 | 0 |
| 0.7229166666666668 | 0 |
| 0.7236111111111111 | 0 |
| 0.7243055555555555 | 0 |
| 0.725 | 0 |
| 0.7256944444444445 | 0 |
| 0.7263888888888889 | 0 |
| 0.7270833333333333 | 0 |
| 0.7277777777777777 | 0 |
| 0.7284722222222223 | 0 |
| 0.7291666666666666 | 0 |
| 0.7298611111111111 | 0 |
| 0.7305555555555556 | 0 |
| 0.7312500000000001 | 0 |
| 0.7319444444444444 | 0 |
| 0.7326388888888888 | 0 |
| 0.7333333333333334 | 0 |
| 0.7340277777777778 | 0 |
| 0.7347222222222222 | 0 |
| 0.7354166666666666 | 0 |
| 0.7361111111111112 | 0 |
| 0.7368055555555556 | 0 |
| 0.7374999999999999 | 0 |
| 0.7381944444444444 | 0 |
| 0.7388888888888889 | 0 |
| 0.7395833333333334 | 0 |
| 0.7402777777777777 | 0 |
| 0.7409722222222223 | 0 |
| 0.7416666666666667 | 0 |
| 0.7423611111111111 | 0 |
| 0.7430555555555555 | 0 |
| 0.74375 | 0 |
| 0.7444444444444445 | 0 |
| 0.7451388888888889 | 0 |
| 0.7458333333333332 | 0 |
| 0.7465277777777778 | 0 |
| 0.7472222222222222 | 0 |
| 0.7479166666666667 | 0 |
| 0.748611111111111 | 0 |
| 0.7493055555555556 | 0 |
| 0.75 | 0 |
| 0.7506944444444444 | 0 |
| 0.751388888888889 | 0 |
| 0.7520833333333333 | 0 |
| 0.7527777777777778 | 0 |
| 0.7534722222222222 | 0 |
| 0.7541666666666668 | 0 |
| 0.7548611111111111 | 0 |
| 0.7555555555555555 | 0 |
| 0.75625 | 0 |
| 0.7569444444444445 | 0 |
| 0.7576388888888889 | 0 |
| 0.7583333333333333 | 0 |
| 0.7590277777777777 | 0 |
| 0.7597222222222223 | 0 |
| 0.7604166666666666 | 0 |
| 0.7611111111111111 | 0 |
| 0.7618055555555556 | 0 |
| 0.7625000000000001 | 0 |
| 0.7631944444444444 | 0 |
| 0.7638888888888888 | 0 |
| 0.7645833333333334 | 0 |
| 0.7652777777777778 | 0 |
| 0.7659722222222222 | 0 |
| 0.7666666666666666 | 0 |
| 0.7673611111111112 | 0 |
| 0.7680555555555556 | 0 |
| 0.7687499999999999 | 0 |
| 0.7694444444444444 | 0 |
| 0.7701388888888889 | 0 |
| 0.7708333333333334 | 0 |
| 0.7715277777777777 | 0 |
| 0.7722222222222223 | 0 |
| 0.7729166666666667 | 0 |
| 0.7736111111111111 | 0 |
| 0.7743055555555555 | 0 |
| 0.775 | 0 |
| 0.7756944444444445 | 0 |
| 0.7763888888888889 | 0 |
| 0.7770833333333332 | 0 |
| 0.7777777777777778 | 0 |
| 0.7784722222222222 | 0 |
| 0.7791666666666667 | 0 |
| 0.779861111111111 | 0 |
| 0.7805555555555556 | 0 |
| 0.78125 | 0 |
| 0.7819444444444444 | 0 |
| 0.782638888888889 | 0 |
| 0.7833333333333333 | 0 |
| 0.7840277777777778 | 0 |
| 0.7847222222222222 | 0 |
| 0.7854166666666668 | 0 |
| 0.7861111111111111 | 0 |
| 0.7868055555555555 | 0 |
| 0.7875 | 0 |
| 0.7881944444444445 | 0 |
| 0.7888888888888889 | 0 |
| 0.7895833333333333 | 0 |
| 0.7902777777777777 | 0 |
| 0.7909722222222223 | 0 |
| 0.7916666666666666 | 0 |
| 0.7923611111111111 | 0 |
| 0.7930555555555556 | 0 |
| 0.7937500000000001 | 0 |
| 0.7944444444444444 | 0 |
| 0.7951388888888888 | 0 |
| 0.7958333333333334 | 0 |
| 0.7965277777777778 | 0 |
| 0.7972222222222222 | 0 |
| 0.7979166666666666 | 0 |
| 0.7986111111111112 | 0 |
| 0.7993055555555556 | 0 |
| 0.7999999999999999 | 0 |
| 0.8006944444444444 | 0 |
| 0.8013888888888889 | 0 |
| 0.8020833333333334 | 0 |
| 0.8027777777777777 | 0 |
| 0.8034722222222223 | 0 |
| 0.8041666666666667 | 0 |
| 0.8048611111111111 | 0 |
| 0.8055555555555555 | 0 |
| 0.80625 | 0 |
| 0.8069444444444445 | 0 |
| 0.8076388888888889 | 0 |
| 0.8083333333333332 | 0 |
| 0.8090277777777778 | 0 |
| 0.8097222222222222 | 0 |
| 0.8104166666666667 | 0 |
| 0.811111111111111 | 0 |
| 0.8118055555555556 | 0 |
| 0.8125 | 0 |
| 0.8131944444444444 | 0 |
| 0.813888888888889 | 0 |
| 0.8145833333333333 | 0 |
| 0.8152777777777778 | 0 |
| 0.8159722222222222 | 0 |
| 0.8166666666666668 | 0 |
| 0.8173611111111111 | 0 |
| 0.8180555555555555 | 0 |
| 0.81875 | 0 |
| 0.8194444444444445 | 0 |
| 0.8201388888888889 | 0 |
| 0.8208333333333333 | 0 |
| 0.8215277777777777 | 0 |
| 0.8222222222222223 | 0 |
| 0.8229166666666666 | 0 |
| 0.8236111111111111 | 0 |
| 0.8243055555555556 | 0 |
| 0.8250000000000001 | 0 |
| 0.8256944444444444 | 0 |
| 0.8263888888888888 | 0 |
| 0.8270833333333334 | 0 |
| 0.8277777777777778 | 0 |
| 0.8284722222222222 | 0 |
| 0.8291666666666666 | 0 |
| 0.8298611111111112 | 0 |
| 0.8305555555555556 | 0 |
| 0.8312499999999999 | 0 |
| 0.8319444444444444 | 0 |
| 0.8326388888888889 | 0 |
| 0.8333333333333334 | 0 |
| 0.8340277777777777 | 0 |
| 0.8347222222222223 | 0 |
| 0.8354166666666667 | 0 |
| 0.8361111111111111 | 0 |
| 0.8368055555555555 | 0 |
| 0.8375 | 0 |
| 0.8381944444444445 | 0 |
| 0.8388888888888889 | 0 |
| 0.8395833333333332 | 0 |
| 0.8402777777777778 | 0 |
| 0.8409722222222222 | 0 |
| 0.8416666666666667 | 0 |
| 0.842361111111111 | 0 |
| 0.8430555555555556 | 0 |
| 0.84375 | 0 |
| 0.8444444444444444 | 0 |
| 0.845138888888889 | 0 |
| 0.8458333333333333 | 0 |
| 0.8465277777777778 | 0 |
| 0.8472222222222222 | 0 |
| 0.8479166666666668 | 0 |
| 0.8486111111111111 | 0 |
| 0.8493055555555555 | 0 |
| 0.85 | 0 |
| 0.8506944444444445 | 0 |
| 0.8513888888888889 | 0 |
| 0.8520833333333333 | 0 |
| 0.8527777777777777 | 0 |
| 0.8534722222222223 | 0 |
| 0.8541666666666666 | 0 |
| 0.8548611111111111 | 0 |
| 0.8555555555555556 | 0 |
| 0.8562500000000001 | 0 |
| 0.8569444444444444 | 0 |
| 0.8576388888888888 | 0 |
| 0.8583333333333334 | 0 |
| 0.8590277777777778 | 0 |
| 0.8597222222222222 | 0 |
| 0.8604166666666666 | 0 |
| 0.8611111111111112 | 0 |
| 0.8618055555555556 | 0 |
| 0.8624999999999999 | 0 |
| 0.8631944444444444 | 0 |
| 0.8638888888888889 | 0 |
| 0.8645833333333334 | 0 |
| 0.8652777777777777 | 0 |
| 0.8659722222222223 | 0 |
| 0.8666666666666667 | 0 |
| 0.8673611111111111 | 0 |
| 0.8680555555555555 | 0 |
| 0.86875 | 0 |
| 0.8694444444444445 | 0 |
| 0.8701388888888889 | 0 |
| 0.8708333333333332 | 0 |
| 0.8715277777777778 | 0 |
| 0.8722222222222222 | 0 |
| 0.8729166666666667 | 0 |
| 0.873611111111111 | 0 |
| 0.8743055555555556 | 0 |
| 0.875 | 0 |
| 0.8756944444444444 | 0 |
| 0.876388888888889 | 0 |
| 0.8770833333333333 | 0 |
| 0.8777777777777778 | 0 |
| 0.8784722222222222 | 0 |
| 0.8791666666666668 | 0 |
| 0.8798611111111111 | 0 |
| 0.8805555555555555 | 0 |
| 0.88125 | 0 |
| 0.8819444444444445 | 0 |
| 0.8826388888888889 | 0 |
| 0.8833333333333333 | 0 |
| 0.8840277777777777 | 0 |
| 0.8847222222222223 | 0 |
| 0.8854166666666666 | 0 |
| 0.8861111111111111 | 0 |
| 0.8868055555555556 | 0 |
| 0.8875000000000001 | 0 |
| 0.8881944444444444 | 0 |
| 0.8888888888888888 | 0 |
| 0.8895833333333334 | 0 |
| 0.8902777777777778 | 0 |
| 0.8909722222222222 | 0 |
| 0.8916666666666666 | 0 |
| 0.8923611111111112 | 0 |
| 0.8930555555555556 | 0 |
| 0.8937499999999999 | 0 |
| 0.8944444444444444 | 0 |
| 0.8951388888888889 | 0 |
| 0.8958333333333334 | 0 |
| 0.8965277777777777 | 0 |
| 0.8972222222222223 | 0 |
| 0.8979166666666667 | 0 |
| 0.8986111111111111 | 0 |
| 0.8993055555555555 | 0 |
| 0.9 | 0 |
| 0.9006944444444445 | 0 |
| 0.9013888888888889 | 0 |
| 0.9020833333333332 | 0 |
| 0.9027777777777778 | 0 |
| 0.9034722222222222 | 0 |
| 0.9041666666666667 | 0 |
| 0.904861111111111 | 0 |
| 0.9055555555555556 | 0 |
| 0.90625 | 0 |
| 0.9069444444444444 | 0 |
| 0.907638888888889 | 0 |
| 0.9083333333333333 | 0 |
| 0.9090277777777778 | 0 |
| 0.9097222222222222 | 0 |
| 0.9104166666666668 | 0 |
| 0.9111111111111111 | 0 |
| 0.9118055555555555 | 0 |
| 0.9125 | 0 |
| 0.9131944444444445 | 0 |
| 0.9138888888888889 | 0 |
| 0.9145833333333333 | 0 |
| 0.9152777777777777 | 0 |
| 0.9159722222222223 | 0 |
| 0.9166666666666666 | 0 |
| 0.9173611111111111 | 0 |
| 0.9180555555555556 | 0 |
| 0.9187500000000001 | 0 |
| 0.9194444444444444 | 0 |
| 0.9201388888888888 | 0 |
| 0.9208333333333334 | 0 |
| 0.9215277777777778 | 0 |
| 0.9222222222222222 | 0 |
| 0.9229166666666666 | 0 |
| 0.9236111111111112 | 0 |
| 0.9243055555555556 | 0 |
| 0.9249999999999999 | 0 |
| 0.9256944444444444 | 0 |
| 0.9263888888888889 | 0 |
| 0.9270833333333334 | 0 |
| 0.9277777777777777 | 0 |
| 0.9284722222222223 | 0 |
| 0.9291666666666667 | 0 |
| 0.9298611111111111 | 0 |
| 0.9305555555555555 | 0 |
| 0.93125 | 0 |
| 0.9319444444444445 | 0 |
| 0.9326388888888889 | 0 |
| 0.9333333333333332 | 0 |
| 0.9340277777777778 | 0 |
| 0.9347222222222222 | 0 |
| 0.9354166666666667 | 0 |
| 0.936111111111111 | 0 |
| 0.9368055555555556 | 0 |
| 0.9375 | 0 |
| 0.9381944444444444 | 0 |
| 0.938888888888889 | 0 |
| 0.9395833333333333 | 0 |
| 0.9402777777777778 | 0 |
| 0.9409722222222222 | 0 |
| 0.9416666666666668 | 0 |
| 0.9423611111111111 | 0 |
| 0.9430555555555555 | 0 |
| 0.94375 | 0 |
| 0.9444444444444445 | 0 |
| 0.9451388888888889 | 0 |
| 0.9458333333333333 | 0 |
| 0.9465277777777777 | 0 |
| 0.9472222222222223 | 0 |
| 0.9479166666666666 | 0 |
| 0.9486111111111111 | 0 |
| 0.9493055555555556 | 0 |
| 0.9500000000000001 | 0 |
| 0.9506944444444444 | 0 |
| 0.9513888888888888 | 0 |
| 0.9520833333333334 | 0 |
| 0.9527777777777778 | 0 |
| 0.9534722222222222 | 0 |
| 0.9541666666666666 | 0 |
| 0.9548611111111112 | 0 |
| 0.9555555555555556 | 0 |
| 0.9562499999999999 | 0 |
| 0.9569444444444444 | 0 |
| 0.9576388888888889 | 0 |
| 0.9583333333333334 | 0 |
| 0.9590277777777777 | 0 |
| 0.9597222222222223 | 0 |
| 0.9604166666666667 | 0 |
| 0.9611111111111111 | 0 |
| 0.9618055555555555 | 0 |
| 0.9625 | 0 |
| 0.9631944444444445 | 0 |
| 0.9638888888888889 | 0 |
| 0.9645833333333332 | 0 |
| 0.9652777777777778 | 0 |
| 0.9659722222222222 | 0 |
| 0.9666666666666667 | 0 |
| 0.967361111111111 | 0 |
| 0.9680555555555556 | 0 |
| 0.96875 | 0 |
| 0.9694444444444444 | 0 |
| 0.970138888888889 | 0 |
| 0.9708333333333333 | 0 |
| 0.9715277777777778 | 0 |
| 0.9722222222222222 | 0 |
| 0.9729166666666668 | 0 |
| 0.9736111111111111 | 0 |
| 0.9743055555555555 | 0 |
| 0.975 | 0 |
| 0.9756944444444445 | 0 |
| 0.9763888888888889 | 0 |
| 0.9770833333333333 | 0 |
| 0.9777777777777777 | 0 |
| 0.9784722222222223 | 0 |
| 0.9791666666666666 | 0 |
| 0.9798611111111111 | 0 |
| 0.9805555555555556 | 0 |
| 0.9812500000000001 | 0 |
| 0.9819444444444444 | 0 |
| 0.9826388888888888 | 0 |
| 0.9833333333333334 | 0 |
| 0.9840277777777778 | 0 |
| 0.9847222222222222 | 0 |
| 0.9854166666666666 | 0 |
| 0.9861111111111112 | 0 |
| 0.9868055555555556 | 0 |
| 0.9874999999999999 | 0 |
| 0.9881944444444444 | 0 |
| 0.9888888888888889 | 0 |
| 0.9895833333333334 | 0 |
| 0.9902777777777777 | 0 |
| 0.9909722222222223 | 0 |
| 0.9916666666666667 | 0 |
| 0.9923611111111111 | 0 |
| 0.9930555555555555 | 0 |
| 0.99375 | 0 |
| 0.9944444444444445 | 0 |
| 0.9951388888888889 | 0 |
| 0.9958333333333332 | 0 |
| 0.9965277777777778 | 0 |
| 0.9972222222222222 | 0 |
| 0.9979166666666667 | 0 |
| 0.998611111111111 | 0 |
| 0.9993055555555556 | 0 |